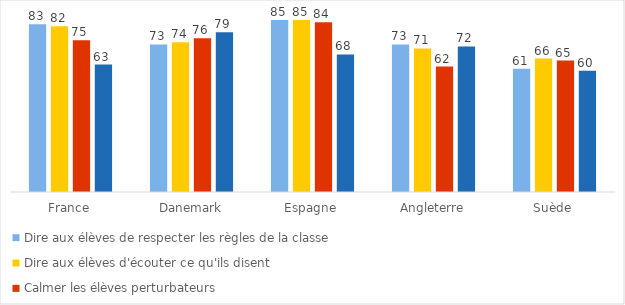
| Category | Dire aux élèves de respecter les règles de la classe | Dire aux élèves d'écouter ce qu'ils disent | Calmer les élèves perturbateurs | Demander aux élèves de se calmer rapidement en début de séance |
|---|---|---|---|---|
| France | 83 | 82 | 75 | 63 |
| Danemark | 73 | 74 | 76 | 79 |
| Espagne | 85 | 85 | 84 | 68 |
| Angleterre | 73 | 71 | 62 | 72 |
| Suède | 61 | 66 | 65 | 60 |